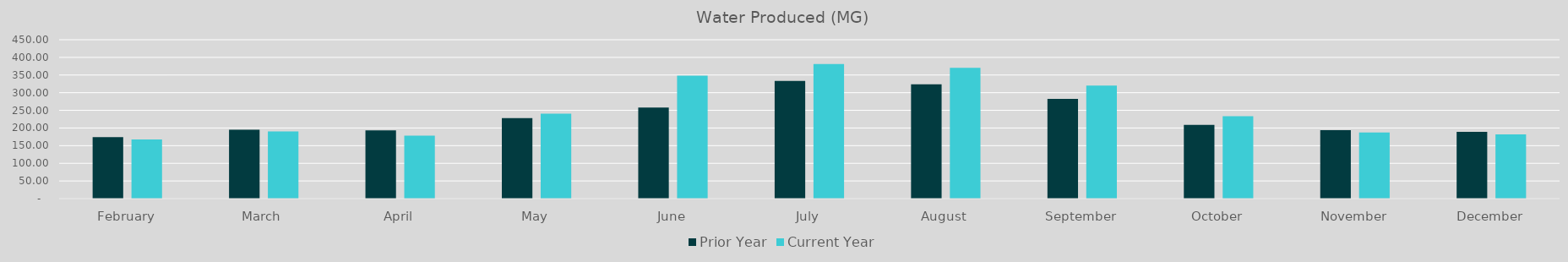
| Category | Prior Year | Current Year |
|---|---|---|
| February | 173.847 | 167.532 |
| March | 195.333 | 190.306 |
| April | 193.551 | 178.22 |
| May | 228.091 | 240.625 |
| June | 257.9 | 348.57 |
| July | 333.37 | 381.34 |
| August | 323.49 | 370.12 |
| September | 282.53 | 320.39 |
| October | 208.72 | 233.34 |
| November | 193.92 | 187.14 |
| December | 188.86 | 182.02 |